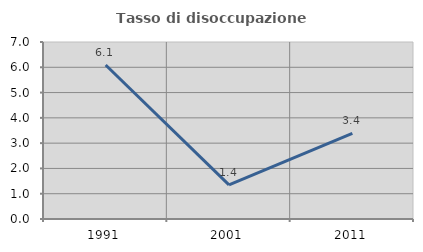
| Category | Tasso di disoccupazione giovanile  |
|---|---|
| 1991.0 | 6.091 |
| 2001.0 | 1.351 |
| 2011.0 | 3.39 |